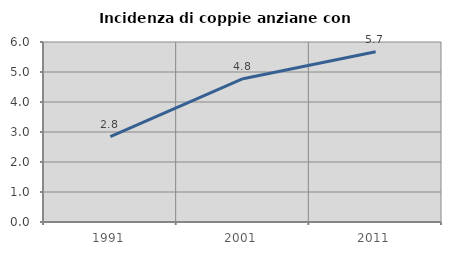
| Category | Incidenza di coppie anziane con figli |
|---|---|
| 1991.0 | 2.842 |
| 2001.0 | 4.778 |
| 2011.0 | 5.675 |